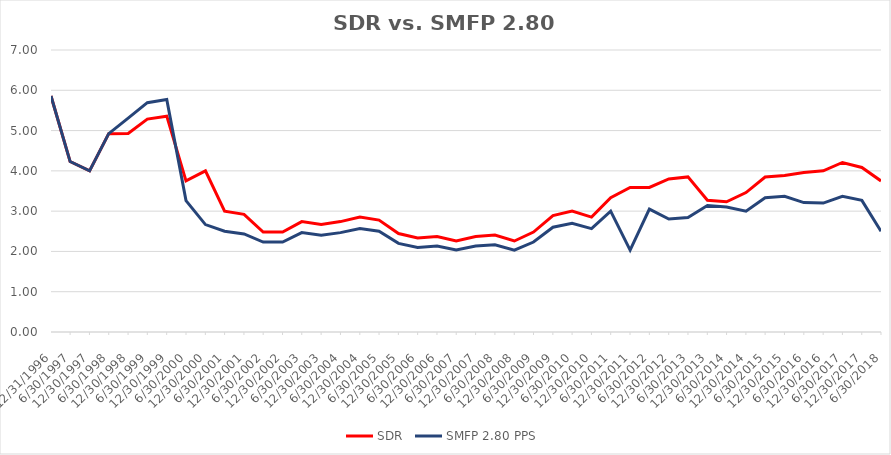
| Category | SDR | SMFP 2.80 PPS |
|---|---|---|
| 12/31/96 | 5.857 | 5.857 |
| 6/30/97 | 4.231 | 4.231 |
| 12/31/97 | 4 | 4 |
| 6/30/98 | 4.923 | 4.923 |
| 12/31/98 | 4.929 | 5.308 |
| 6/30/99 | 5.286 | 5.692 |
| 12/31/99 | 5.357 | 5.769 |
| 6/30/00 | 3.75 | 3.261 |
| 12/31/00 | 4 | 2.667 |
| 6/30/01 | 3 | 2.5 |
| 12/31/01 | 2.92 | 2.433 |
| 6/30/02 | 2.481 | 2.233 |
| 12/31/02 | 2.481 | 2.233 |
| 6/30/03 | 2.741 | 2.467 |
| 12/31/03 | 2.667 | 2.4 |
| 6/30/04 | 2.741 | 2.467 |
| 12/31/04 | 2.852 | 2.567 |
| 6/30/05 | 2.778 | 2.5 |
| 12/31/05 | 2.444 | 2.2 |
| 6/30/06 | 2.333 | 2.1 |
| 12/31/06 | 2.37 | 2.133 |
| 6/30/07 | 2.259 | 2.033 |
| 12/31/07 | 2.37 | 2.133 |
| 6/30/08 | 2.407 | 2.167 |
| 12/31/08 | 2.259 | 2.033 |
| 6/30/09 | 2.481 | 2.233 |
| 12/31/09 | 2.889 | 2.6 |
| 6/30/10 | 3 | 2.7 |
| 12/31/10 | 2.852 | 2.567 |
| 6/30/11 | 3.333 | 3 |
| 12/31/11 | 3.588 | 2.033 |
| 6/30/12 | 3.588 | 3.05 |
| 12/31/12 | 3.8 | 2.806 |
| 6/30/13 | 3.85 | 2.843 |
| 12/31/13 | 3.269 | 3.138 |
| 6/30/14 | 3.231 | 3.101 |
| 12/31/14 | 3.462 | 3 |
| 6/30/15 | 3.846 | 3.333 |
| 12/31/15 | 3.885 | 3.367 |
| 6/30/16 | 3.958 | 3.213 |
| 12/31/16 | 4 | 3.2 |
| 6/30/17 | 4.208 | 3.367 |
| 12/31/17 | 4.083 | 3.267 |
| 6/30/18 | 3.75 | 2.5 |